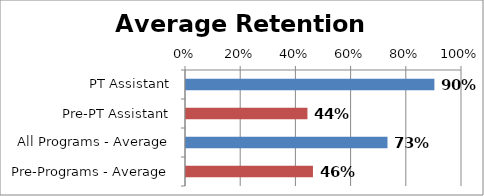
| Category | Series 0 |
|---|---|
| PT Assistant | 0.9 |
| Pre-PT Assistant | 0.44 |
| All Programs - Average | 0.73 |
| Pre-Programs - Average | 0.46 |